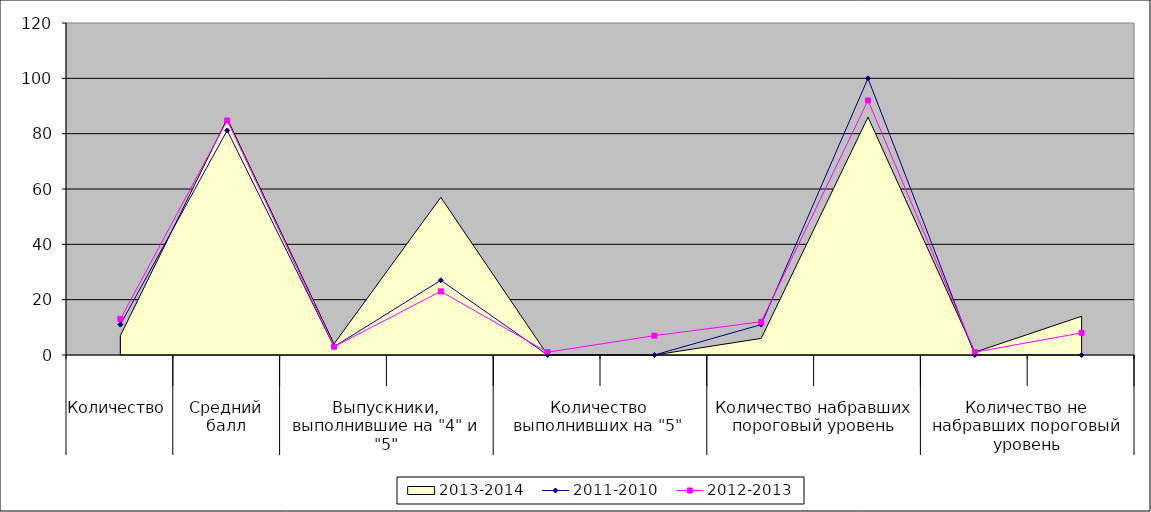
| Category | 2011-2010 | 2012-2013 |
|---|---|---|
| 0 | 11 | 13 |
| 1 | 81.18 | 84.76 |
| 2 | 3 | 3 |
| 3 | 27 | 23 |
| 4 | 0 | 1 |
| 5 | 0 | 7 |
| 6 | 11 | 12 |
| 7 | 100 | 92 |
| 8 | 0 | 1 |
| 9 | 0 | 8 |